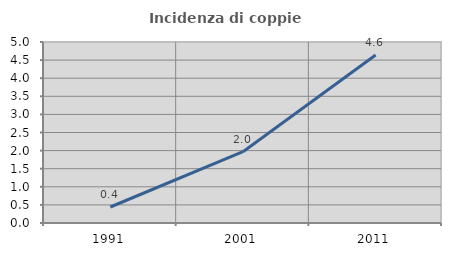
| Category | Incidenza di coppie miste |
|---|---|
| 1991.0 | 0.442 |
| 2001.0 | 1.97 |
| 2011.0 | 4.643 |